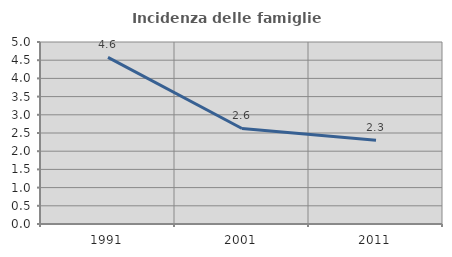
| Category | Incidenza delle famiglie numerose |
|---|---|
| 1991.0 | 4.579 |
| 2001.0 | 2.625 |
| 2011.0 | 2.3 |